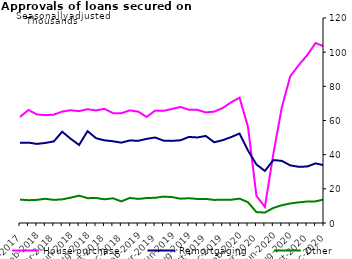
| Category | House purchase | Remortgaging | Other |
|---|---|---|---|
| Dec-2017 | 62081 | 46899 | 13700 |
| Jan-2018 | 66155 | 47053 | 13335 |
| Feb-2018 | 63550 | 46296 | 13544 |
| Mar-2018 | 63168 | 46862 | 14175 |
| Apr-2018 | 63421 | 47750 | 13524 |
| May-2018 | 65226 | 53433 | 13835 |
| Jun-2018 | 66004 | 49312 | 14824 |
| Jul-2018 | 65482 | 45680 | 16005 |
| Aug-2018 | 66629 | 53781 | 14530 |
| Sep-2018 | 65880 | 49652 | 14648 |
| Oct-2018 | 66847 | 48395 | 13870 |
| Nov-2018 | 64312 | 47848 | 14470 |
| Dec-2018 | 64265 | 47019 | 12650 |
| Jan-2019 | 65930 | 48327 | 14666 |
| Feb-2019 | 65191 | 48110 | 14102 |
| Mar-2019 | 62082 | 49254 | 14585 |
| Apr-2019 | 65795 | 50046 | 14765 |
| May-2019 | 65643 | 48213 | 15450 |
| Jun-2019 | 66776 | 48063 | 15180 |
| Jul-2019 | 67931 | 48428 | 14222 |
| Aug-2019 | 66311 | 50373 | 14500 |
| Sep-2019 | 66225 | 50075 | 14075 |
| Oct-2019 | 64741 | 50954 | 14107 |
| Nov-2019 | 65197 | 47258 | 13500 |
| Dec-2019 | 67303 | 48465 | 13652 |
| Jan-2020 | 70630 | 50290 | 13598 |
| Feb-2020 | 73365 | 52385 | 14268 |
| Mar-2020 | 56180 | 42428 | 12141 |
| Apr-2020 | 15913 | 34247 | 6366 |
| May-2020 | 9358 | 30483 | 6119 |
| Jun-2020 | 40406 | 36828 | 8803 |
| Jul-2020 | 67543 | 36364 | 10398 |
| Aug-2020 | 85840 | 33750 | 11425 |
| Sep-2020 | 92402 | 32898 | 12084 |
| Oct-2020 | 98195 | 33050 | 12561 |
| Nov-2020 | 105324 | 34893 | 12661 |
| Dec-2020 | 103381 | 33799 | 13801 |